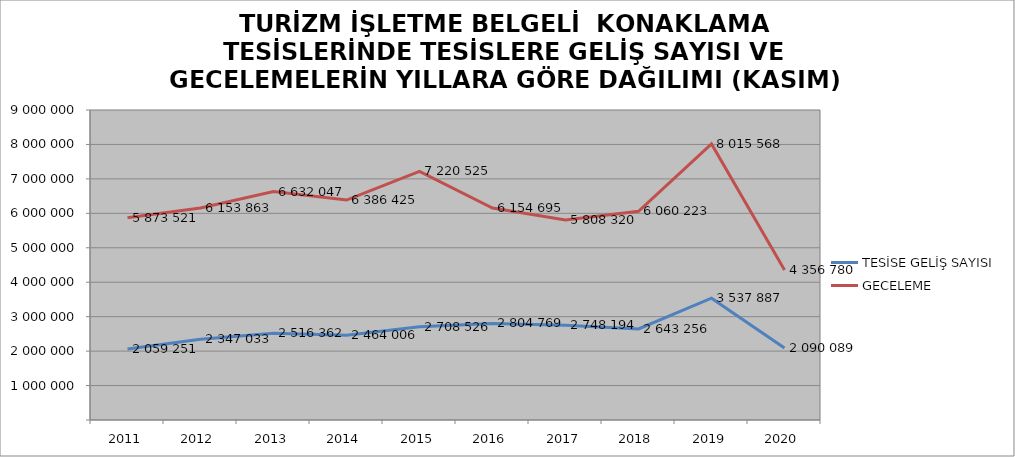
| Category | TESİSE GELİŞ SAYISI | GECELEME |
|---|---|---|
| 2011 | 2059251 | 5873521 |
| 2012 | 2347033 | 6153863 |
| 2013 | 2516362 | 6632047 |
| 2014 | 2464006 | 6386425 |
| 2015 | 2708526 | 7220525 |
| 2016 | 2804769 | 6154695 |
| 2017 | 2748194 | 5808320 |
| 2018 | 2643256 | 6060223 |
| 2019 | 3537887 | 8015568 |
| 2020 | 2090089 | 4356780 |